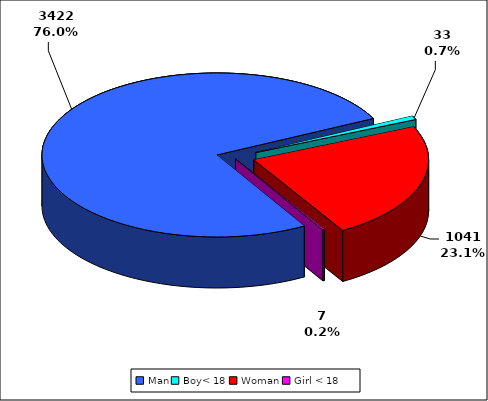
| Category | TOTAL |
|---|---|
| Man | 3422 |
| Boy< 18 | 33 |
| Woman | 1041 |
| Girl < 18 | 7 |